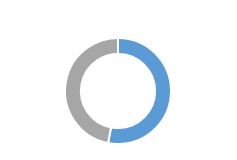
| Category | Series 0 |
|---|---|
| 0 | 0.53 |
| 1 | 0.47 |